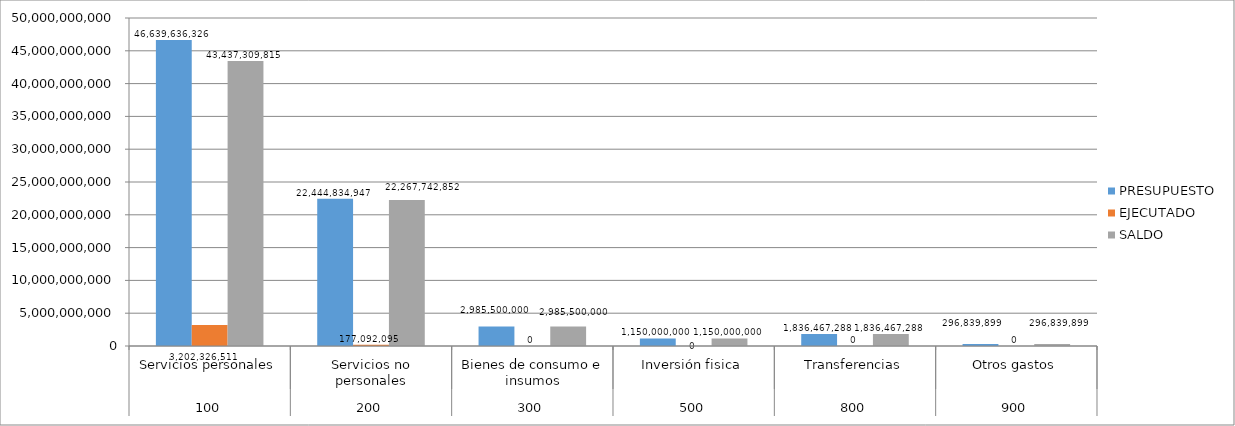
| Category | PRESUPUESTO | EJECUTADO | SALDO |
|---|---|---|---|
| 0 | 46639636326 | 3202326511 | 43437309815 |
| 1 | 22444834947 | 177092095 | 22267742852 |
| 2 | 2985500000 | 0 | 2985500000 |
| 3 | 1150000000 | 0 | 1150000000 |
| 4 | 1836467288 | 0 | 1836467288 |
| 5 | 296839899 | 0 | 296839899 |